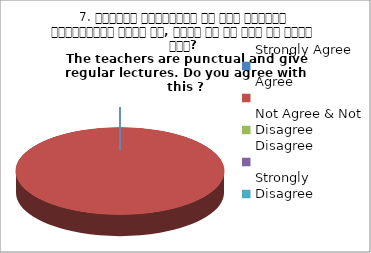
| Category | 7. शिक्षक समयनिष्ट है एवं नियमित व्याख्यान देते है, क्या आप इस बात से सहमत हैं? 
The teachers are punctual and give regular lectures. Do you agree with this ?
 Agree Agree Agree Agree Agree Agree |
|---|---|
| Strongly Agree | 0 |
| Agree | 4 |
| Not Agree & Not Disagree | 0 |
| Disagree | 0 |
| Strongly Disagree | 0 |